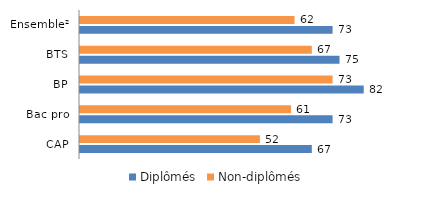
| Category | Diplômés | Non-diplômés |
|---|---|---|
| CAP | 67 | 52 |
| Bac pro | 73 | 61 |
| BP | 82 | 73 |
| BTS | 75 | 67 |
| Ensemble² | 73 | 62 |